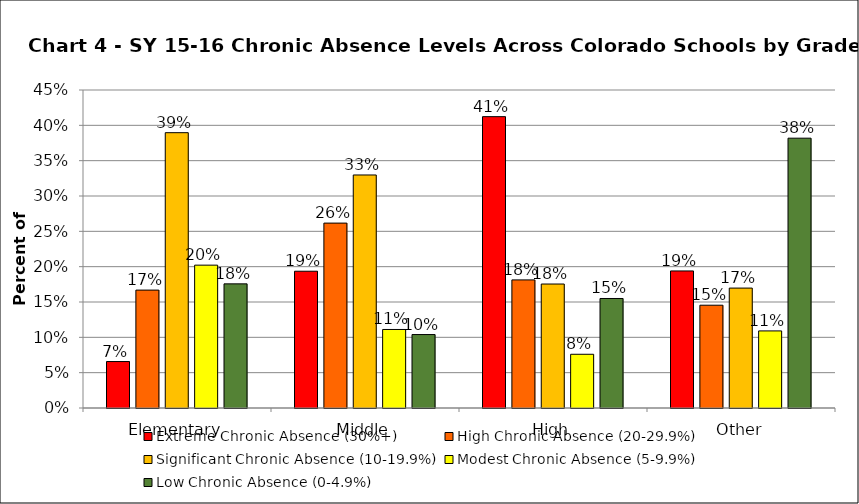
| Category | Extreme Chronic Absence (30%+) | High Chronic Absence (20-29.9%) | Significant Chronic Absence (10-19.9%) | Modest Chronic Absence (5-9.9%) | Low Chronic Absence (0-4.9%) |
|---|---|---|---|---|---|
| 0 | 0.066 | 0.167 | 0.39 | 0.202 | 0.176 |
| 1 | 0.194 | 0.262 | 0.33 | 0.111 | 0.104 |
| 2 | 0.412 | 0.181 | 0.175 | 0.076 | 0.155 |
| 3 | 0.194 | 0.145 | 0.17 | 0.109 | 0.382 |